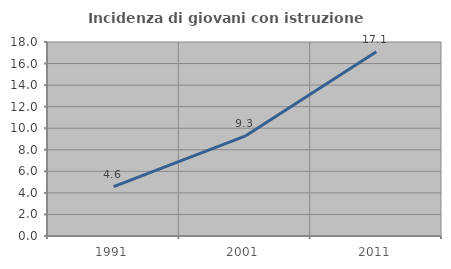
| Category | Incidenza di giovani con istruzione universitaria |
|---|---|
| 1991.0 | 4.573 |
| 2001.0 | 9.259 |
| 2011.0 | 17.101 |